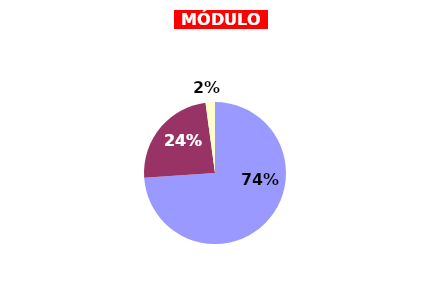
| Category | Series 0 |
|---|---|
| ÓTIMO | 73.886 |
| BOM | 23.93 |
| REGULAR | 2.134 |